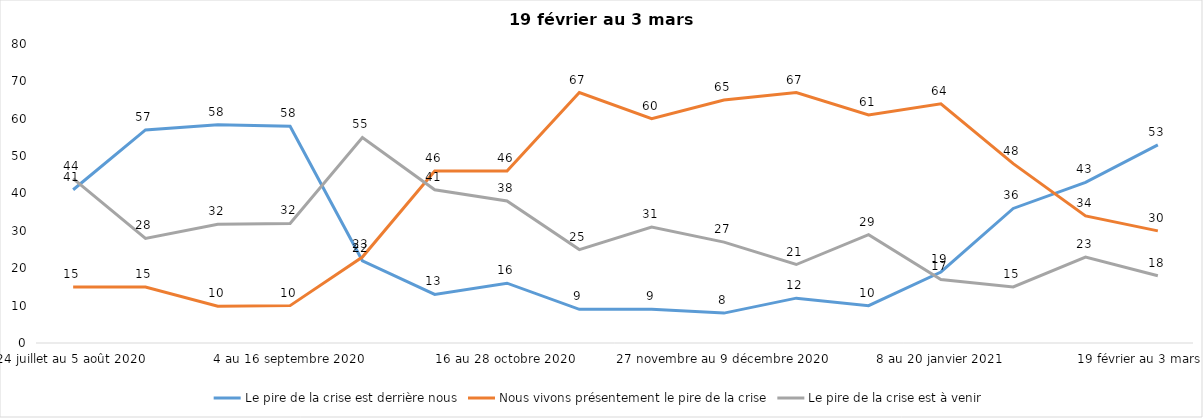
| Category | Le pire de la crise est derrière nous | Nous vivons présentement le pire de la crise | Le pire de la crise est à venir |
|---|---|---|---|
| 24 juillet au 5 août 2020 | 41 | 15 | 44 |
| 7 au 19 août 2020 | 57 | 15 | 28 |
| 21 août au 2 septembre 2020 | 58.39 | 9.84 | 31.77 |
| 4 au 16 septembre 2020 | 58 | 10 | 32 |
| 18 au 30 septembre 2020 | 22 | 23 | 55 |
| 2 au 14 octobre 2020 | 13 | 46 | 41 |
| 16 au 28 octobre 2020 | 16 | 46 | 38 |
| 30 octobre au 11 novembre 2020 | 9 | 67 | 25 |
| 13 au 25 novembre 2020 | 9 | 60 | 31 |
| 27 novembre au 9 décembre 2020 | 8 | 65 | 27 |
| 11 au 25 décembre 2020 | 12 | 67 | 21 |
| 25 décembre 2020 au 6 janvier 2021 | 10 | 61 | 29 |
| 8 au 20 janvier 2021 | 19 | 64 | 17 |
| 22 janvier au 3 février 2021 | 36 | 48 | 15 |
| 5 au 17 février 2021 | 43 | 34 | 23 |
| 19 février au 3 mars 2021 | 53 | 30 | 18 |